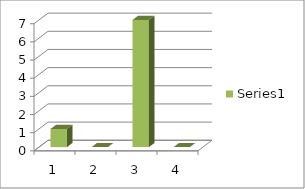
| Category | Series 0 |
|---|---|
| 0 | 1 |
| 1 | 0 |
| 2 | 7 |
| 3 | 0 |